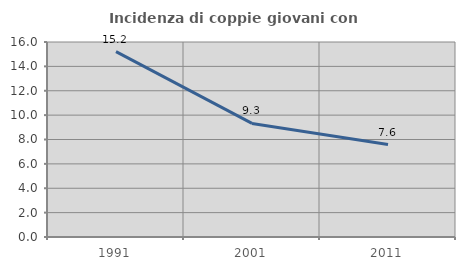
| Category | Incidenza di coppie giovani con figli |
|---|---|
| 1991.0 | 15.215 |
| 2001.0 | 9.319 |
| 2011.0 | 7.584 |